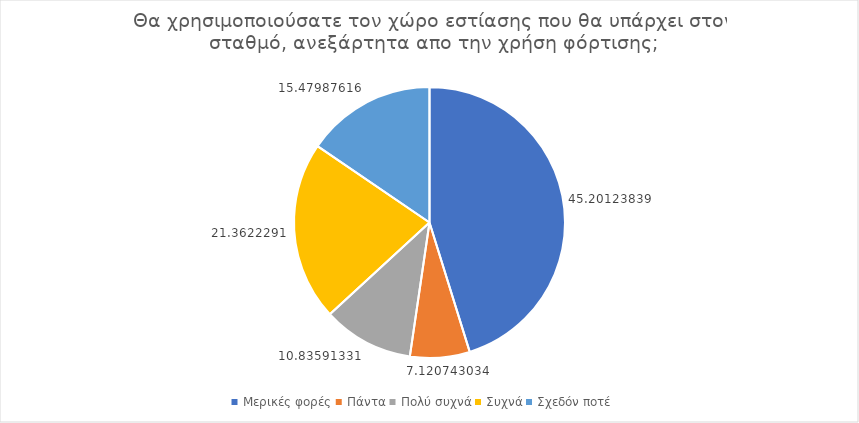
| Category | Series 0 |
|---|---|
| Μερικές φορές | 45.201 |
| Πάντα | 7.121 |
| Πολύ συχνά | 10.836 |
| Συχνά | 21.362 |
| Σχεδόν ποτέ | 15.48 |